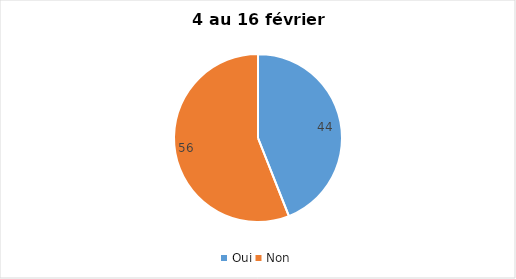
| Category | Series 0 |
|---|---|
| Oui | 44 |
| Non | 56 |